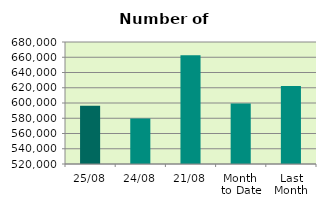
| Category | Series 0 |
|---|---|
| 25/08 | 596286 |
| 24/08 | 579830 |
| 21/08 | 662572 |
| Month 
to Date | 599259.529 |
| Last
Month | 622411.826 |